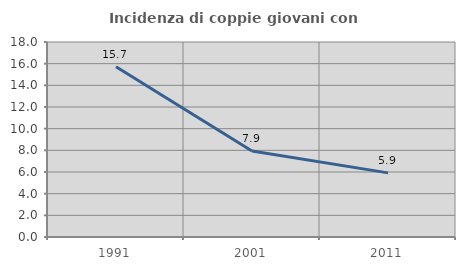
| Category | Incidenza di coppie giovani con figli |
|---|---|
| 1991.0 | 15.721 |
| 2001.0 | 7.933 |
| 2011.0 | 5.918 |